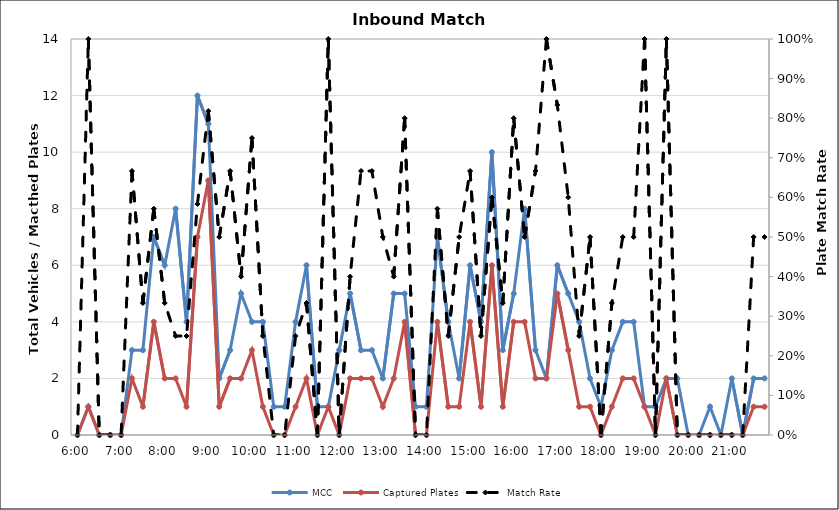
| Category | MCC | Captured Plates |
|---|---|---|
| 0.25 | 0 | 0 |
| 0.260416666666667 | 1 | 1 |
| 0.270833333333333 | 0 | 0 |
| 0.28125 | 0 | 0 |
| 0.291666666666667 | 0 | 0 |
| 0.302083333333333 | 3 | 2 |
| 0.3125 | 3 | 1 |
| 0.322916666666667 | 7 | 4 |
| 0.333333333333333 | 6 | 2 |
| 0.34375 | 8 | 2 |
| 0.354166666666667 | 4 | 1 |
| 0.364583333333333 | 12 | 7 |
| 0.375 | 11 | 9 |
| 0.385416666666667 | 2 | 1 |
| 0.395833333333333 | 3 | 2 |
| 0.40625 | 5 | 2 |
| 0.416666666666667 | 4 | 3 |
| 0.427083333333333 | 4 | 1 |
| 0.4375 | 1 | 0 |
| 0.447916666666667 | 1 | 0 |
| 0.458333333333333 | 4 | 1 |
| 0.46875 | 6 | 2 |
| 0.479166666666667 | 1 | 0 |
| 0.489583333333333 | 1 | 1 |
| 0.5 | 3 | 0 |
| 0.510416666666667 | 5 | 2 |
| 0.520833333333333 | 3 | 2 |
| 0.53125 | 3 | 2 |
| 0.541666666666667 | 2 | 1 |
| 0.552083333333333 | 5 | 2 |
| 0.5625 | 5 | 4 |
| 0.572916666666667 | 1 | 0 |
| 0.583333333333333 | 1 | 0 |
| 0.59375 | 7 | 4 |
| 0.604166666666667 | 4 | 1 |
| 0.614583333333333 | 2 | 1 |
| 0.625 | 6 | 4 |
| 0.635416666666667 | 4 | 1 |
| 0.645833333333333 | 10 | 6 |
| 0.65625 | 3 | 1 |
| 0.666666666666667 | 5 | 4 |
| 0.677083333333333 | 8 | 4 |
| 0.6875 | 3 | 2 |
| 0.697916666666667 | 2 | 2 |
| 0.708333333333333 | 6 | 5 |
| 0.71875 | 5 | 3 |
| 0.729166666666667 | 4 | 1 |
| 0.739583333333333 | 2 | 1 |
| 0.75 | 1 | 0 |
| 0.760416666666667 | 3 | 1 |
| 0.770833333333333 | 4 | 2 |
| 0.78125 | 4 | 2 |
| 0.791666666666667 | 1 | 1 |
| 0.802083333333333 | 1 | 0 |
| 0.8125 | 2 | 2 |
| 0.822916666666667 | 2 | 0 |
| 0.833333333333333 | 0 | 0 |
| 0.84375 | 0 | 0 |
| 0.854166666666667 | 1 | 0 |
| 0.864583333333333 | 0 | 0 |
| 0.875 | 2 | 0 |
| 0.885416666666667 | 0 | 0 |
| 0.895833333333333 | 2 | 1 |
| 0.90625 | 2 | 1 |